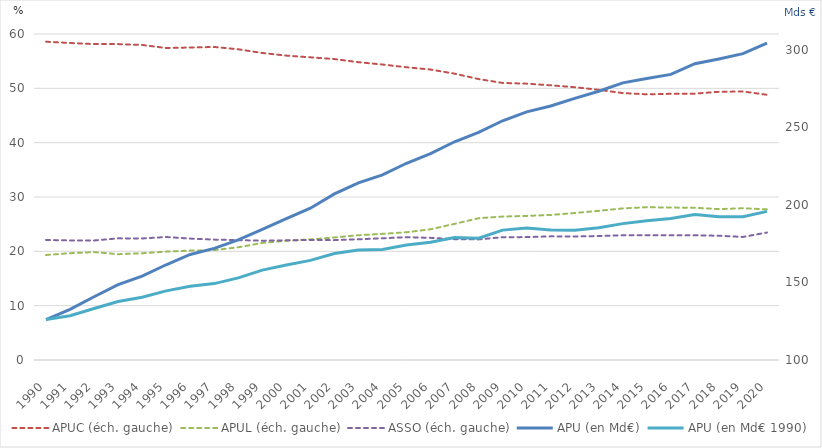
| Category | APUC (éch. gauche) | APUL (éch. gauche) | ASSO (éch. gauche) |
|---|---|---|---|
| 1990.0 | 58.575 | 19.327 | 22.098 |
| 1991.0 | 58.346 | 19.653 | 22.001 |
| 1992.0 | 58.141 | 19.86 | 22 |
| 1993.0 | 58.14 | 19.473 | 22.387 |
| 1994.0 | 57.984 | 19.649 | 22.367 |
| 1995.0 | 57.416 | 19.946 | 22.638 |
| 1996.0 | 57.515 | 20.139 | 22.346 |
| 1997.0 | 57.614 | 20.229 | 22.157 |
| 1998.0 | 57.188 | 20.747 | 22.065 |
| 1999.0 | 56.507 | 21.544 | 21.949 |
| 2000.0 | 56.021 | 21.946 | 22.033 |
| 2001.0 | 55.707 | 22.197 | 22.096 |
| 2002.0 | 55.385 | 22.553 | 22.062 |
| 2003.0 | 54.811 | 22.967 | 22.222 |
| 2004.0 | 54.383 | 23.217 | 22.4 |
| 2005.0 | 53.877 | 23.515 | 22.608 |
| 2006.0 | 53.461 | 24.057 | 22.482 |
| 2007.0 | 52.702 | 25.056 | 22.241 |
| 2008.0 | 51.707 | 26.096 | 22.197 |
| 2009.0 | 50.993 | 26.402 | 22.605 |
| 2010.0 | 50.86 | 26.522 | 22.618 |
| 2011.0 | 50.556 | 26.689 | 22.754 |
| 2012.0 | 50.206 | 27.052 | 22.743 |
| 2013.0 | 49.727 | 27.456 | 22.816 |
| 2014.0 | 49.128 | 27.902 | 22.97 |
| 2015.0 | 48.901 | 28.121 | 22.978 |
| 2016.0 | 48.992 | 28.053 | 22.955 |
| 2017.0 | 49.025 | 28.022 | 22.953 |
| 2018.0 | 49.362 | 27.772 | 22.866 |
| 2019.0 | 49.421 | 27.929 | 22.65 |
| 2020.0 | 48.813 | 27.727 | 23.46 |